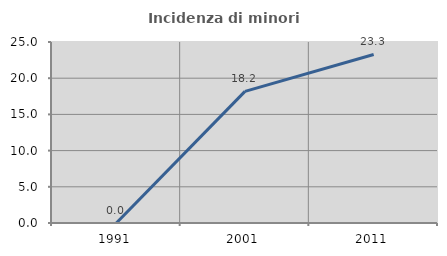
| Category | Incidenza di minori stranieri |
|---|---|
| 1991.0 | 0 |
| 2001.0 | 18.182 |
| 2011.0 | 23.276 |